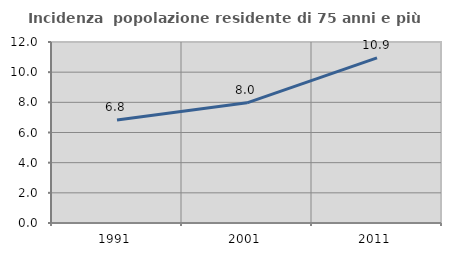
| Category | Incidenza  popolazione residente di 75 anni e più |
|---|---|
| 1991.0 | 6.824 |
| 2001.0 | 7.968 |
| 2011.0 | 10.947 |